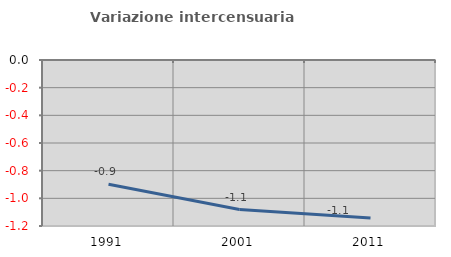
| Category | Variazione intercensuaria annua |
|---|---|
| 1991.0 | -0.898 |
| 2001.0 | -1.081 |
| 2011.0 | -1.141 |